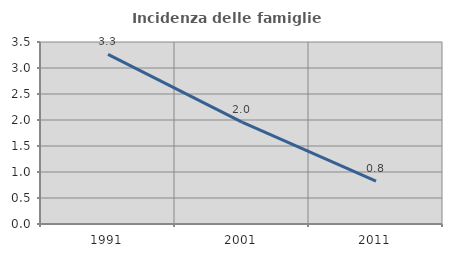
| Category | Incidenza delle famiglie numerose |
|---|---|
| 1991.0 | 3.261 |
| 2001.0 | 1.961 |
| 2011.0 | 0.826 |